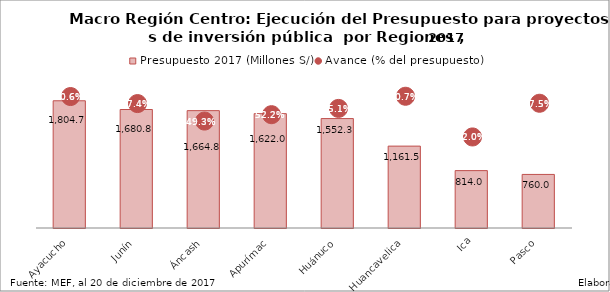
| Category | Presupuesto 2017 (Millones S/) |
|---|---|
| Ayacucho | 1804.677 |
| Junín | 1680.827 |
| Áncash | 1664.755 |
| Apurímac | 1621.958 |
| Huánuco | 1552.296 |
| Huancavelica | 1161.526 |
| Ica | 813.992 |
| Pasco | 759.966 |